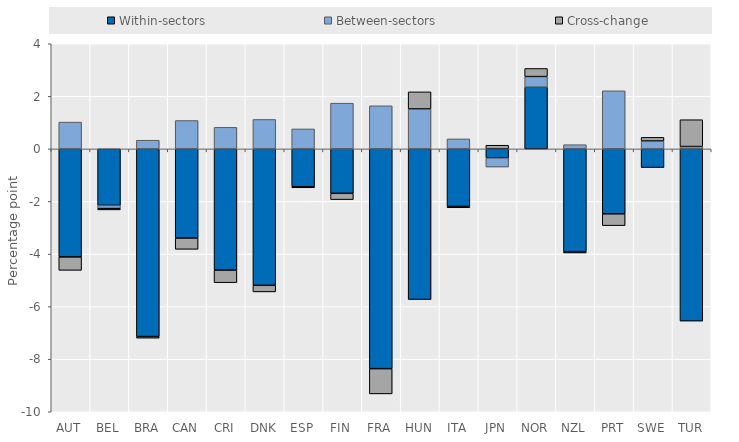
| Category | Within-sectors | Between-sectors | Cross-change |
|---|---|---|---|
| AUT | -4.11 | 1.02 | -0.51 |
| BEL | -2.15 | -0.11 | -0.06 |
| BRA | -7.14 | 0.33 | -0.06 |
| CAN | -3.39 | 1.08 | -0.43 |
| CRI | -4.61 | 0.82 | -0.48 |
| DNK | -5.19 | 1.12 | -0.25 |
| ESP | -1.44 | 0.76 | -0.04 |
| FIN | -1.69 | 1.74 | -0.24 |
| FRA | -8.36 | 1.64 | -0.96 |
| HUN | -5.73 | 1.52 | 0.65 |
| ITA | -2.19 | 0.38 | -0.05 |
| JPN | -0.34 | -0.35 | 0.14 |
| NOR | 2.35 | 0.4 | 0.31 |
| NZL | -3.91 | 0.16 | -0.05 |
| PRT | -2.47 | 2.21 | -0.45 |
| SWE | -0.71 | 0.3 | 0.14 |
| TUR | -6.55 | 0.09 | 1.02 |